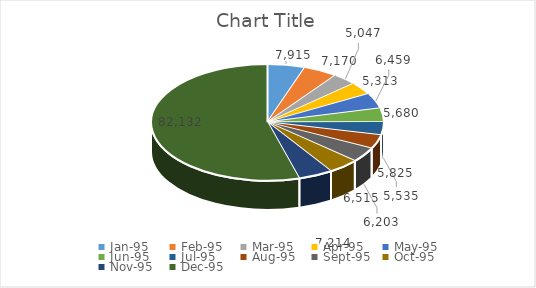
| Category | Series 0 |
|---|---|
| 34700.0 | 7915 |
| 34731.0 | 7170 |
| 34759.0 | 5047 |
| 34790.0 | 5313 |
| 34820.0 | 6459 |
| 34851.0 | 5680 |
| 34881.0 | 5535 |
| 34912.0 | 5825 |
| 34943.0 | 6203 |
| 34973.0 | 6515 |
| 35004.0 | 7214 |
| 35034.0 | 82132 |